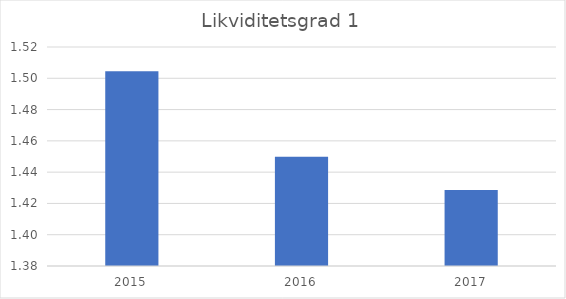
| Category | Likviditetsgrad 1 |
|---|---|
| 2015.0 | 1.504 |
| 2016.0 | 1.45 |
| 2017.0 | 1.429 |